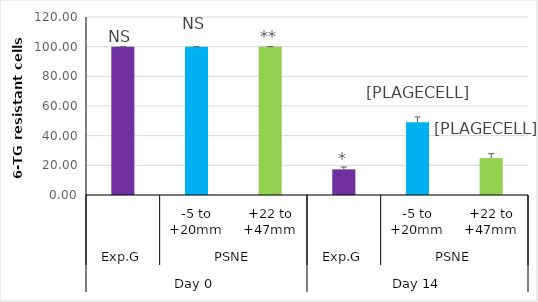
| Category | Series 0 |
|---|---|
| 0 | 100 |
| 1 | 100 |
| 2 | 100 |
| 3 | 17.308 |
| 4 | 49.076 |
| 5 | 24.854 |